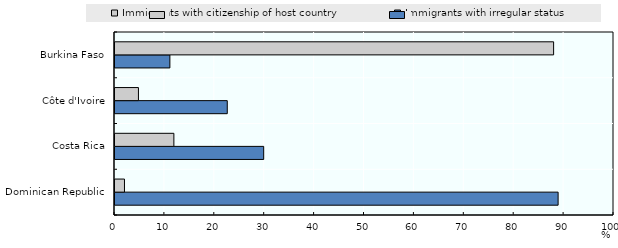
| Category | Immigrants with irregular status  | Immigrants with citizenship of host country |
|---|---|---|
| Dominican Republic | 88.8 | 1.9 |
| Costa Rica | 29.8 | 11.8 |
| Côte d'Ivoire | 22.5 | 4.7 |
| Burkina Faso | 11 | 87.9 |